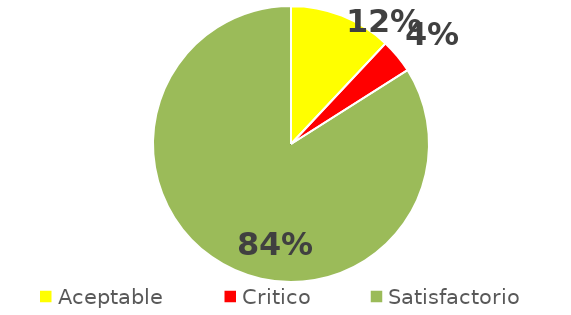
| Category | Series 0 |
|---|---|
| Aceptable | 0.12 |
| Critico | 0.04 |
| Satisfactorio | 0.84 |